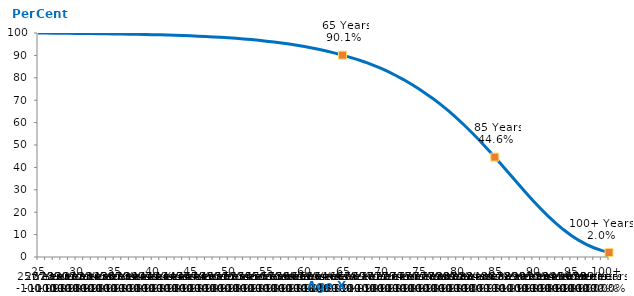
| Category | Male aged 25 years in 2018 |
|---|---|
|  25 | 100 |
|  26 | 99.966 |
|  27 | 99.932 |
|  28 | 99.897 |
|  29 | 99.861 |
|  30 | 99.823 |
|  31 | 99.782 |
|  32 | 99.738 |
|  33 | 99.692 |
|  34 | 99.644 |
|  35 | 99.592 |
|  36 | 99.538 |
|  37 | 99.481 |
|  38 | 99.419 |
|  39 | 99.351 |
|  40 | 99.274 |
|  41 | 99.19 |
|  42 | 99.096 |
|  43 | 98.992 |
|  44 | 98.877 |
|  45 | 98.747 |
|  46 | 98.603 |
|  47 | 98.444 |
|  48 | 98.268 |
|  49 | 98.07 |
|  50 | 97.851 |
|  51 | 97.608 |
|  52 | 97.342 |
|  53 | 97.048 |
|  54 | 96.722 |
|  55 | 96.361 |
|  56 | 95.966 |
|  57 | 95.534 |
|  58 | 95.059 |
|  59 | 94.532 |
|  60 | 93.949 |
|  61 | 93.306 |
|  62 | 92.606 |
|  63 | 91.843 |
|  64 | 91.011 |
|  65 | 90.11 |
|  66 | 89.14 |
|  67 | 88.098 |
|  68 | 86.962 |
|  69 | 85.698 |
|  70 | 84.289 |
|  71 | 82.736 |
|  72 | 81.045 |
|  73 | 79.21 |
|  74 | 77.22 |
|  75 | 75.08 |
|  76 | 72.802 |
|  77 | 70.388 |
|  78 | 67.808 |
|  79 | 65.016 |
|  80 | 62.006 |
|  81 | 58.811 |
|  82 | 55.469 |
|  83 | 51.988 |
|  84 | 48.36 |
|  85 | 44.592 |
|  86 | 40.733 |
|  87 | 36.823 |
|  88 | 32.91 |
|  89 | 29.043 |
|  90 | 25.277 |
|  91 | 21.664 |
|  92 | 18.258 |
|  93 | 15.104 |
|  94 | 12.244 |
|  95 | 9.706 |
|  96 | 7.509 |
|  97 | 5.655 |
|  98 | 4.136 |
|  99 | 2.929 |
| 100+ | 2.003 |